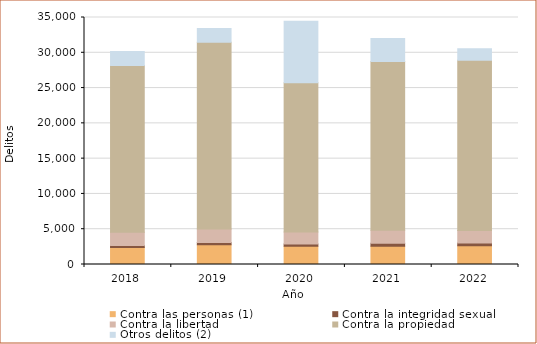
| Category | Contra las personas (1) | Contra la integridad sexual | Contra la libertad | Contra la propiedad | Otros delitos (2) |
|---|---|---|---|---|---|
| 2018.0 | 2404 | 280 | 1878 | 23646 | 1988 |
| 2019.0 | 2799 | 322 | 1905 | 26480 | 1927 |
| 2020.0 | 2580 | 314 | 1715 | 21151 | 8702 |
| 2021.0 | 2592 | 414 | 1843 | 23932 | 3250 |
| 2022.0 | 2671 | 375 | 1789 | 24090 | 1643 |